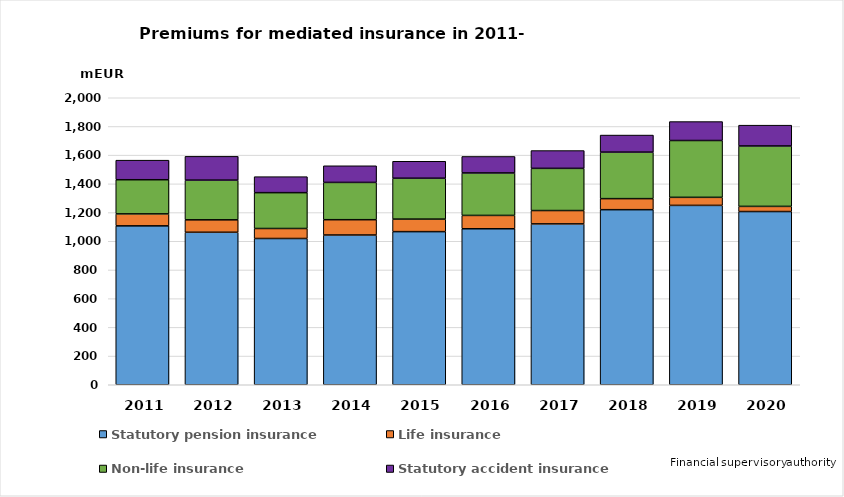
| Category | Statutory pension insurance | Life insurance | Non-life insurance | Statutory accident insurance |
|---|---|---|---|---|
| 2011.0 | 1107.329 | 83.403 | 238.041 | 136.289 |
| 2012.0 | 1062.705 | 86.597 | 276.62 | 165.706 |
| 2013.0 | 1019.216 | 69.648 | 249.823 | 111.515 |
| 2014.0 | 1043.573 | 106.619 | 259.835 | 115.957 |
| 2015.0 | 1067.062 | 87.285 | 284.943 | 118.153 |
| 2016.0 | 1087 | 93 | 296 | 115 |
| 2017.0 | 1121 | 93 | 294 | 124 |
| 2018.0 | 1220 | 77 | 324 | 119 |
| 2019.0 | 1250 | 56 | 396 | 132 |
| 2020.0 | 1207 | 36 | 421 | 145 |